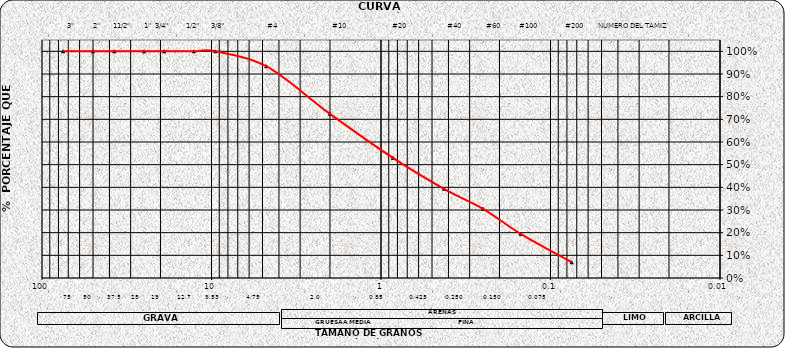
| Category | Series 0 |
|---|---|
| 75.0 | 1 |
| 50.0 | 1 |
| 37.5 | 1 |
| 25.0 | 1 |
| 19.0 | 1 |
| 12.7 | 1 |
| 9.5 | 1 |
| 4.75 | 0.934 |
| 2.0 | 0.724 |
| 0.85 | 0.53 |
| 0.425 | 0.394 |
| 0.25 | 0.305 |
| 0.15 | 0.195 |
| 0.075 | 0.069 |
| nan | 0 |